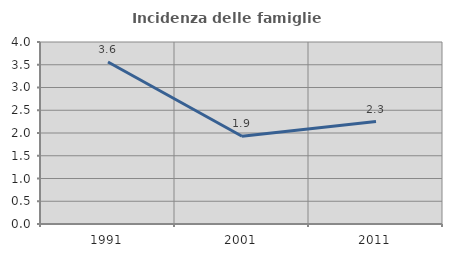
| Category | Incidenza delle famiglie numerose |
|---|---|
| 1991.0 | 3.559 |
| 2001.0 | 1.929 |
| 2011.0 | 2.25 |